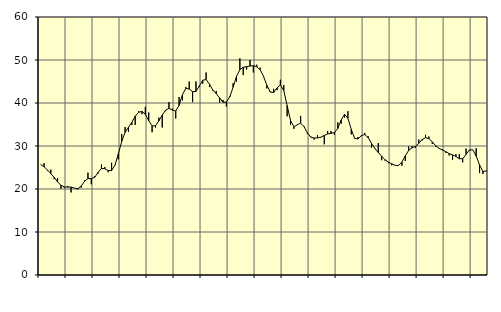
| Category | Piggar | Series 1 |
|---|---|---|
| nan | 25.7 | 25.68 |
| 87.0 | 26 | 25.17 |
| 87.0 | 24.3 | 24.44 |
| 87.0 | 24.5 | 23.59 |
| nan | 22.3 | 22.7 |
| 88.0 | 22.5 | 21.66 |
| 88.0 | 20.1 | 20.87 |
| 88.0 | 20.3 | 20.48 |
| nan | 20.7 | 20.45 |
| 89.0 | 19.2 | 20.46 |
| 89.0 | 20.2 | 20.21 |
| 89.0 | 19.9 | 20.07 |
| nan | 20.3 | 20.69 |
| 90.0 | 22 | 21.79 |
| 90.0 | 23.8 | 22.41 |
| 90.0 | 21.1 | 22.42 |
| nan | 23 | 22.73 |
| 91.0 | 23.6 | 23.86 |
| 91.0 | 25.7 | 24.78 |
| 91.0 | 25.1 | 24.72 |
| nan | 23.9 | 24.28 |
| 92.0 | 26.1 | 24.29 |
| 92.0 | 25.6 | 25.54 |
| 92.0 | 26.9 | 28.16 |
| nan | 32.8 | 31.06 |
| 93.0 | 34.4 | 33.16 |
| 93.0 | 33.3 | 34.34 |
| 93.0 | 34.9 | 35.5 |
| nan | 34.9 | 36.93 |
| 94.0 | 38.1 | 37.84 |
| 94.0 | 37.4 | 38.04 |
| 94.0 | 39.1 | 37.39 |
| nan | 37.8 | 35.9 |
| 95.0 | 33.2 | 34.66 |
| 95.0 | 34.3 | 34.73 |
| 95.0 | 36.6 | 35.85 |
| nan | 34.3 | 37.19 |
| 96.0 | 38.1 | 38.33 |
| 96.0 | 40.2 | 38.74 |
| 96.0 | 38.7 | 38.36 |
| nan | 36.4 | 38.13 |
| 97.0 | 41.4 | 39.45 |
| 97.0 | 40.6 | 41.94 |
| 97.0 | 43.7 | 43.39 |
| nan | 45 | 43.24 |
| 98.0 | 40.2 | 42.63 |
| 98.0 | 45 | 42.69 |
| 98.0 | 43.7 | 43.94 |
| nan | 44.5 | 45.31 |
| 99.0 | 47.1 | 45.44 |
| 99.0 | 43.7 | 44.38 |
| 99.0 | 42.8 | 43.01 |
| nan | 42.8 | 42.16 |
| 0.0 | 40.1 | 41.18 |
| 0.0 | 40.7 | 40.15 |
| 0.0 | 39.2 | 40.2 |
| nan | 41.6 | 41.43 |
| 1.0 | 44.6 | 43.65 |
| 1.0 | 45 | 46.2 |
| 1.0 | 50.4 | 47.74 |
| nan | 46.5 | 48.3 |
| 2.0 | 47.8 | 48.45 |
| 2.0 | 50 | 48.6 |
| 2.0 | 47.1 | 48.68 |
| nan | 48.9 | 48.42 |
| 3.0 | 48.2 | 47.76 |
| 3.0 | 46.1 | 46.22 |
| 3.0 | 43.4 | 44.13 |
| nan | 42.7 | 42.54 |
| 4.0 | 43.3 | 42.42 |
| 4.0 | 43 | 43.49 |
| 4.0 | 45.4 | 44.22 |
| nan | 44.2 | 42.9 |
| 5.0 | 36.9 | 39.4 |
| 5.0 | 34.9 | 35.95 |
| 5.0 | 34 | 34.48 |
| nan | 35 | 34.93 |
| 6.0 | 37 | 35.34 |
| 6.0 | 34.4 | 34.53 |
| 6.0 | 32.8 | 33.07 |
| nan | 32.2 | 32.07 |
| 7.0 | 31.5 | 31.86 |
| 7.0 | 32.5 | 31.89 |
| 7.0 | 32 | 32.06 |
| nan | 30.4 | 32.45 |
| 8.0 | 33.5 | 32.81 |
| 8.0 | 33.5 | 32.94 |
| 8.0 | 32.6 | 33.12 |
| nan | 35.5 | 34.07 |
| 9.0 | 35.2 | 36.03 |
| 9.0 | 36.6 | 37.38 |
| 9.0 | 38.1 | 36.45 |
| nan | 32.7 | 33.86 |
| 10.0 | 31.9 | 31.78 |
| 10.0 | 32.1 | 31.63 |
| 10.0 | 32.3 | 32.43 |
| nan | 33 | 32.66 |
| 11.0 | 32.3 | 31.95 |
| 11.0 | 29.6 | 30.61 |
| 11.0 | 29.3 | 29.42 |
| nan | 30.7 | 28.5 |
| 12.0 | 26.7 | 27.62 |
| 12.0 | 26.6 | 26.8 |
| 12.0 | 26 | 26.25 |
| nan | 25.5 | 25.86 |
| 13.0 | 25.5 | 25.48 |
| 13.0 | 25.6 | 25.49 |
| 13.0 | 25.4 | 26.27 |
| nan | 26.5 | 27.71 |
| 14.0 | 29.9 | 28.97 |
| 14.0 | 30 | 29.57 |
| 14.0 | 29.6 | 29.87 |
| nan | 31.5 | 30.61 |
| 15.0 | 31.3 | 31.52 |
| 15.0 | 32.6 | 31.93 |
| 15.0 | 32.2 | 31.71 |
| nan | 30.5 | 30.96 |
| 16.0 | 29.8 | 30.09 |
| 16.0 | 29.4 | 29.44 |
| 16.0 | 29.2 | 29.06 |
| nan | 28.4 | 28.69 |
| 17.0 | 27.8 | 28.23 |
| 17.0 | 26.8 | 27.92 |
| 17.0 | 28.1 | 27.59 |
| nan | 28.1 | 27.03 |
| 18.0 | 26.2 | 27.06 |
| 18.0 | 29.4 | 28.02 |
| 18.0 | 29 | 29.08 |
| nan | 29.1 | 29.12 |
| 19.0 | 29.5 | 27.67 |
| 19.0 | 23.7 | 25.61 |
| 19.0 | 23.5 | 24.06 |
| nan | 24.1 | 24.22 |